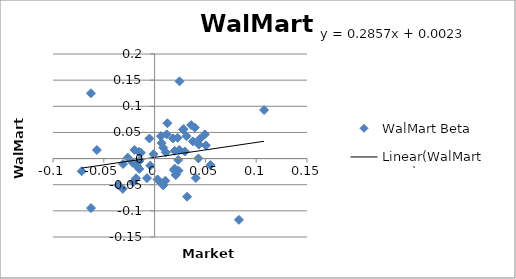
| Category | WalMart Beta |
|---|---|
| 0.011873817294504763 | 0.046 |
| 0.08298311776039413 | -0.117 |
| -0.026442831573227132 | 0.002 |
| -0.06258081816720285 | -0.095 |
| 0.019742029696721453 | 0.015 |
| -0.021011672375900514 | -0.045 |
| 0.010491382393316817 | -0.042 |
| 0.008520819730124751 | -0.051 |
| -0.01739610691375626 | -0.014 |
| 0.054892511014553946 | -0.012 |
| -0.031040805790470194 | -0.01 |
| -0.004188587877920424 | -0.013 |
| 0.02453358876036482 | 0.148 |
| 0.02320146078677232 | -0.003 |
| -0.015513837223063764 | 0.013 |
| 0.03765529548973512 | 0.033 |
| -0.015079830581919862 | -0.02 |
| 0.01905833165892057 | -0.022 |
| 0.021030280012996005 | -0.031 |
| 0.006200788965052828 | 0.043 |
| 0.006932165607935747 | 0.03 |
| 0.04311702997659528 | 0 |
| -0.035582905675162646 | -0.051 |
| 0.02356279155049279 | -0.023 |
| 0.02804947163518645 | 0.056 |
| 0.04459575261800608 | 0.038 |
| 0.029749523177239112 | 0.013 |
| -0.031298019033866864 | -0.058 |
| 0.04946207981522499 | 0.046 |
| -0.014999301636062778 | -0.005 |
| 0.020762811721046104 | -0.031 |
| 0.01808576785925231 | 0.039 |
| 0.035987723516956116 | 0.064 |
| 0.011060649195259176 | 0.012 |
| 0.05042809651957847 | 0.025 |
| 0.007068230463864511 | -0.047 |
| 0.002846717017343403 | -0.04 |
| -0.019789409878227415 | 0.017 |
| 0.024236153696477025 | 0.017 |
| 0.019763369680148246 | -0.019 |
| 0.012597574126154365 | 0.068 |
| 0.03955498213459152 | 0.059 |
| -0.06265072563317764 | 0.125 |
| -0.00749745270927038 | -0.037 |
| 0.03133231453053065 | 0.043 |
| 0.040589464130841746 | -0.037 |
| 0.043583062218506274 | 0.027 |
| 0.008532763948144062 | 0.021 |
| -0.005058715193587249 | 0.038 |
| 0.10772303853581011 | 0.093 |
| -0.07176198830376013 | -0.024 |
| -0.05679110746359761 | 0.016 |
| -0.021474425791952023 | -0.008 |
| -0.01825746126569705 | -0.038 |
| -0.01350095276693064 | 0.011 |
| 0.02849538044379507 | 0.056 |
| -0.0010473132038185673 | 0.008 |
| 0.03195656405295222 | -0.073 |
| 0.02264557398008682 | 0.04 |